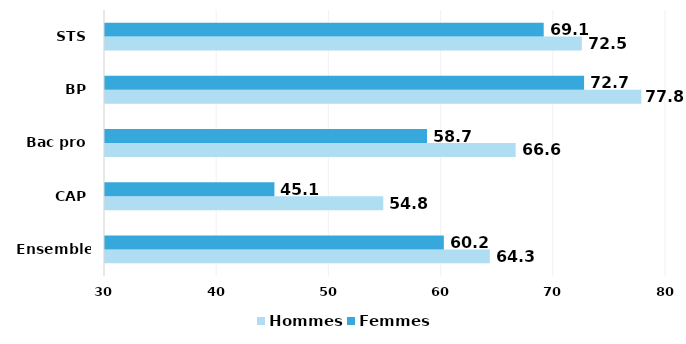
| Category | Hommes | Femmes |
|---|---|---|
| Ensemble* | 64.3 | 60.2 |
| CAP | 54.8 | 45.1 |
| Bac pro | 66.6 | 58.7 |
| BP | 77.8 | 72.7 |
| STS | 72.5 | 69.1 |